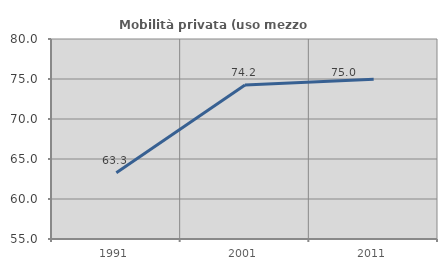
| Category | Mobilità privata (uso mezzo privato) |
|---|---|
| 1991.0 | 63.284 |
| 2001.0 | 74.248 |
| 2011.0 | 74.964 |